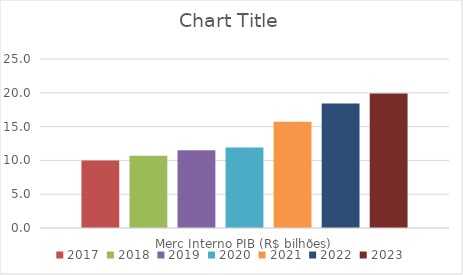
| Category | 2017 | 2018 | 2019 | 2020 | 2021 | 2022 | 2023 |
|---|---|---|---|---|---|---|---|
| Merc Interno PIB (R$ bilhões) | 10 | 10.7 | 11.5 | 11.9 | 15.7 | 18.4 | 19.9 |